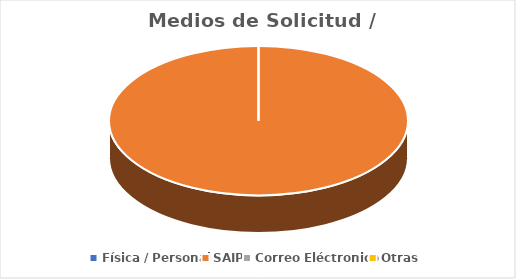
| Category | Series 0 |
|---|---|
| Física / Personal | 0 |
| SAIP | 1 |
| Correo Eléctronico | 0 |
| Otras | 0 |